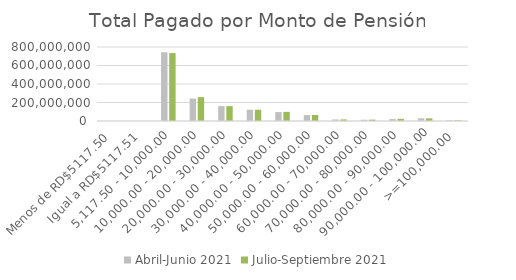
| Category | Abril-Junio 2021 | Julio-Septiembre 2021 |
|---|---|---|
| Menos de RD$5117.50 | 180816.53 | 176816.53 |
| Igual a RD$5117.51 | 5117.5 | 5117.5 |
| 5,117.50 - 10,000.00 | 743156809.96 | 734388808.12 |
| 10,000.00 - 20,000.00 | 242377945.27 | 258148105.94 |
| 20,000.00 - 30,000.00 | 160967038.6 | 160706589.02 |
| 30,000.00 - 40,000.00 | 121803583.56 | 121874426.85 |
| 40,000.00 - 50,000.00 | 96614948.51 | 98519359.4 |
| 50,000.00 - 60,000.00 | 64358921.82 | 65119191.87 |
| 60,000.00 - 70,000.00 | 16486969.1 | 17374248.99 |
| 70,000.00 - 80,000.00 | 13604524.55 | 14705196.38 |
| 80,000.00 - 90,000.00 | 21265395.83 | 23755245.83 |
| 90,000.00 - 100,000.00 | 28698863.35 | 28698863.35 |
| >=100,000.00 | 7070693.6 | 7490693.6 |